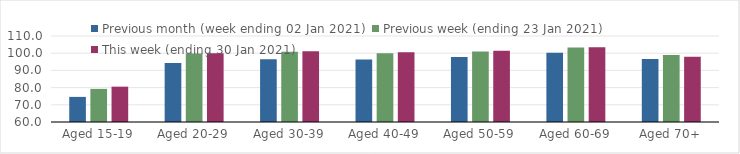
| Category | Previous month (week ending 02 Jan 2021) | Previous week (ending 23 Jan 2021) | This week (ending 30 Jan 2021) |
|---|---|---|---|
| Aged 15-19 | 74.59 | 79.25 | 80.55 |
| Aged 20-29 | 94.25 | 99.78 | 99.97 |
| Aged 30-39 | 96.44 | 100.82 | 101.19 |
| Aged 40-49 | 96.28 | 100.02 | 100.59 |
| Aged 50-59 | 97.77 | 100.97 | 101.48 |
| Aged 60-69 | 100.19 | 103.27 | 103.53 |
| Aged 70+ | 96.58 | 98.97 | 97.95 |